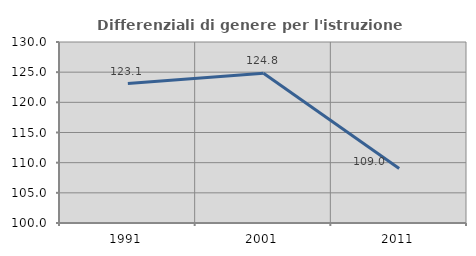
| Category | Differenziali di genere per l'istruzione superiore |
|---|---|
| 1991.0 | 123.111 |
| 2001.0 | 124.82 |
| 2011.0 | 109.034 |